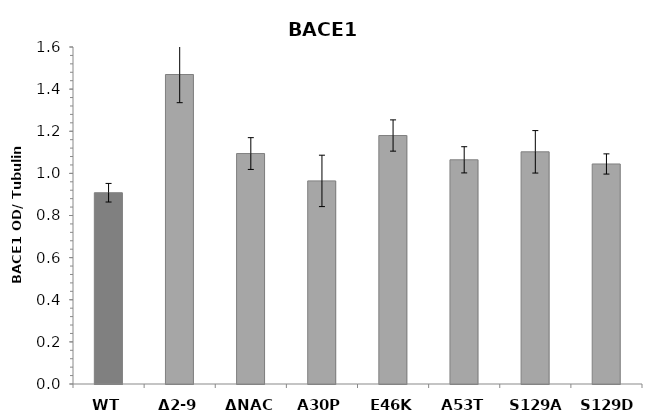
| Category | Series 0 |
|---|---|
| WT | 0.908 |
| Δ2-9 | 1.469 |
| ΔNAC | 1.094 |
| A30P | 0.964 |
| E46K | 1.18 |
| A53T | 1.064 |
| S129A | 1.102 |
| S129D | 1.045 |